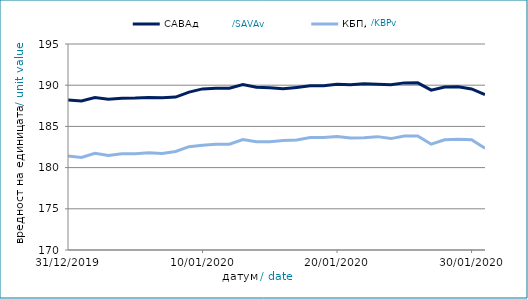
| Category | САВАд | КБПд |
|---|---|---|
| 31/12/2019 | 188.198 | 181.405 |
| 01/01/2020 | 188.094 | 181.235 |
| 02/01/2020 | 188.513 | 181.726 |
| 03/01/2020 | 188.289 | 181.472 |
| 04/01/2020 | 188.431 | 181.68 |
| 05/01/2020 | 188.435 | 181.686 |
| 06/01/2020 | 188.498 | 181.81 |
| 07/01/2020 | 188.466 | 181.719 |
| 08/01/2020 | 188.558 | 181.961 |
| 09/01/2020 | 189.165 | 182.544 |
| 10/01/2020 | 189.55 | 182.721 |
| 11/01/2020 | 189.623 | 182.827 |
| 12/01/2020 | 189.627 | 182.833 |
| 13/01/2020 | 190.08 | 183.4 |
| 14/01/2020 | 189.743 | 183.134 |
| 15/01/2020 | 189.694 | 183.141 |
| 16/01/2020 | 189.558 | 183.3 |
| 17/01/2020 | 189.732 | 183.351 |
| 18/01/2020 | 189.925 | 183.64 |
| 19/01/2020 | 189.93 | 183.646 |
| 20/01/2020 | 190.119 | 183.774 |
| 21/01/2020 | 190.054 | 183.583 |
| 22/01/2020 | 190.161 | 183.632 |
| 23/01/2020 | 190.103 | 183.758 |
| 24/01/2020 | 190.063 | 183.519 |
| 25/01/2020 | 190.281 | 183.822 |
| 26/01/2020 | 190.286 | 183.828 |
| 27/01/2020 | 189.397 | 182.837 |
| 28/01/2020 | 189.79 | 183.374 |
| 29/01/2020 | 189.822 | 183.437 |
| 30/01/2020 | 189.551 | 183.391 |
| 31/01/2020 | 188.868 | 182.358 |